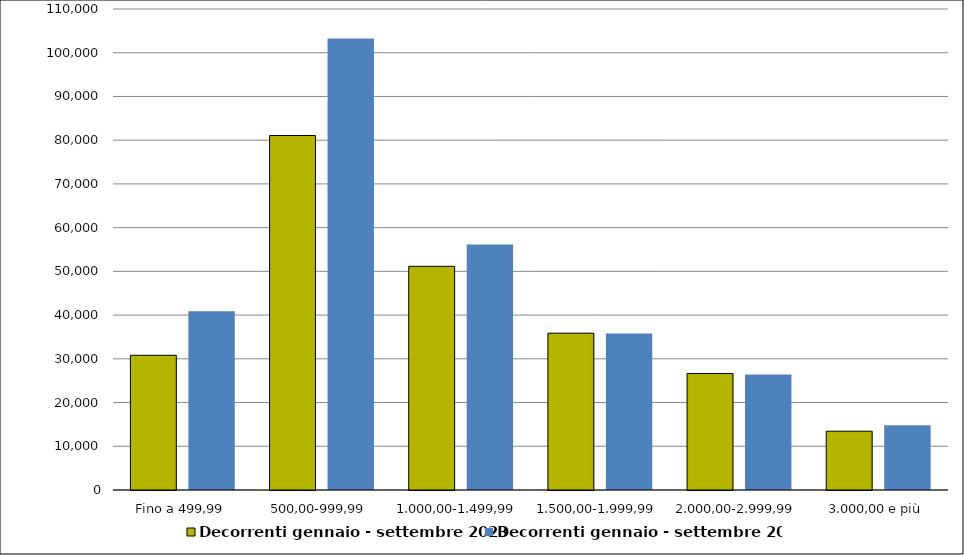
| Category | Decorrenti gennaio - settembre 2023 | Decorrenti gennaio - settembre 2022 |
|---|---|---|
|  Fino a 499,99  | 30810 | 40900 |
|  500,00-999,99  | 81071 | 103282 |
|  1.000,00-1.499,99  | 51157 | 56143 |
|  1.500,00-1.999,99  | 35864 | 35772 |
|  2.000,00-2.999,99  | 26646 | 26408 |
|  3.000,00 e più  | 13448 | 14829 |